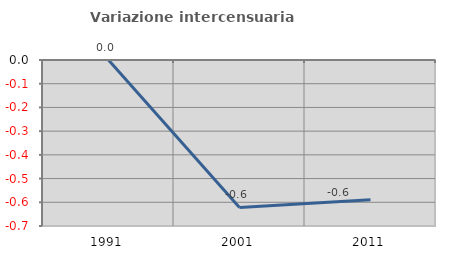
| Category | Variazione intercensuaria annua |
|---|---|
| 1991.0 | 0 |
| 2001.0 | -0.622 |
| 2011.0 | -0.589 |